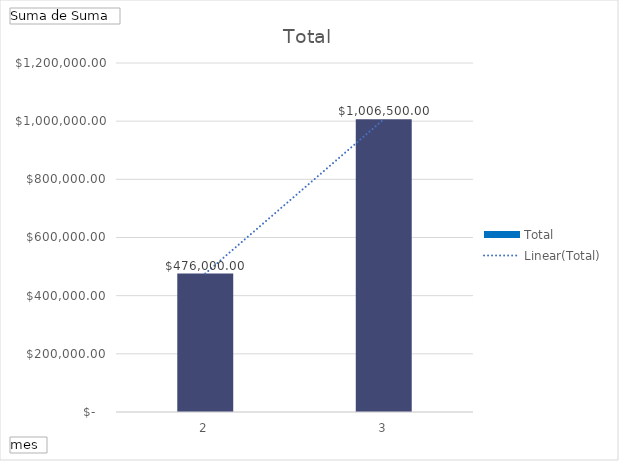
| Category | Total |
|---|---|
| 2 | 476000 |
| 3 | 1006500 |